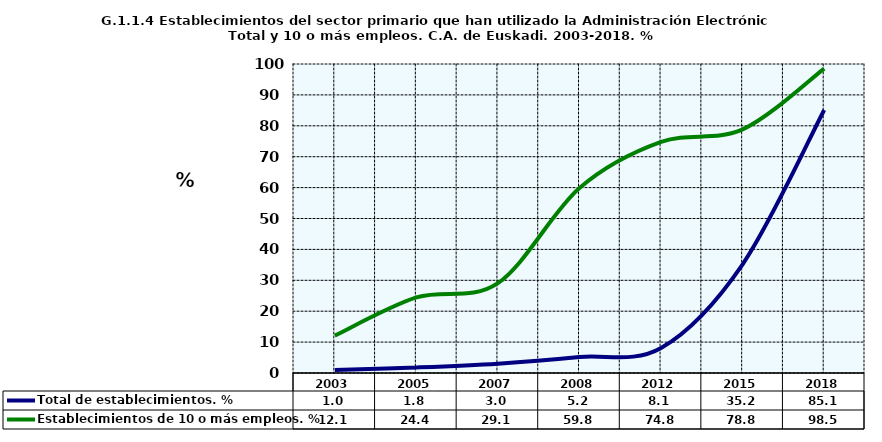
| Category | Total de establecimientos. % | Establecimientos de 10 o más empleos. % |
|---|---|---|
| 2003.0 | 0.969 | 12.077 |
| 2005.0 | 1.791 | 24.444 |
| 2007.0 | 3.033 | 29.082 |
| 2008.0 | 5.176 | 59.848 |
| 2012.0 | 8.118 | 74.783 |
| 2015.0 | 35.191 | 78.832 |
| 2018.0 | 85.112 | 98.519 |